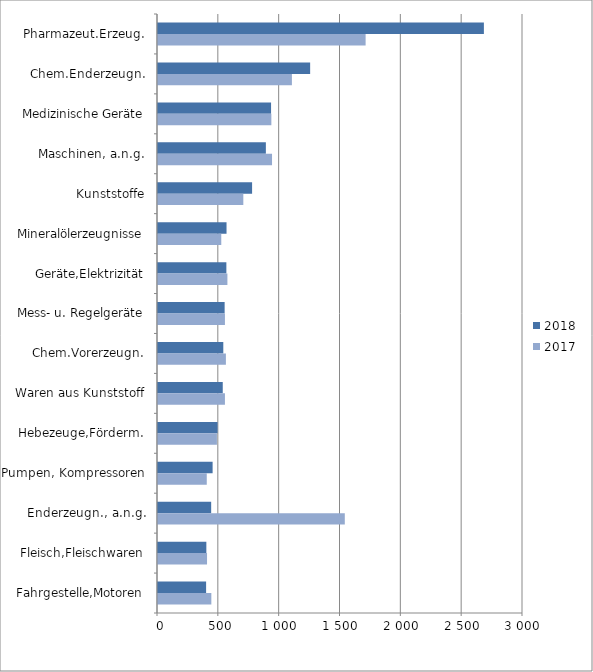
| Category | 2018 | 2017 |
|---|---|---|
| Pharmazeut.Erzeug. | 2678.524 | 1706.378 |
| Chem.Enderzeugn. | 1250.524 | 1100.651 |
| Medizinische Geräte | 929.288 | 931.671 |
| Maschinen, a.n.g. | 886.562 | 937.239 |
| Kunststoffe | 773.359 | 701.255 |
| Mineralölerzeugnisse | 563.322 | 520.024 |
| Geräte,Elektrizität | 561.926 | 570.461 |
| Mess- u. Regelgeräte | 547.699 | 550.191 |
| Chem.Vorerzeugn. | 536.718 | 558.083 |
| Waren aus Kunststoff | 532.219 | 550.185 |
| Hebezeuge,Förderm. | 489.559 | 484.29 |
| Pumpen, Kompressoren | 448.847 | 400.815 |
| Enderzeugn., a.n.g. | 437.007 | 1535.328 |
| Fleisch,Fleischwaren | 397.391 | 403.013 |
| Fahrgestelle,Motoren | 395.409 | 438.392 |